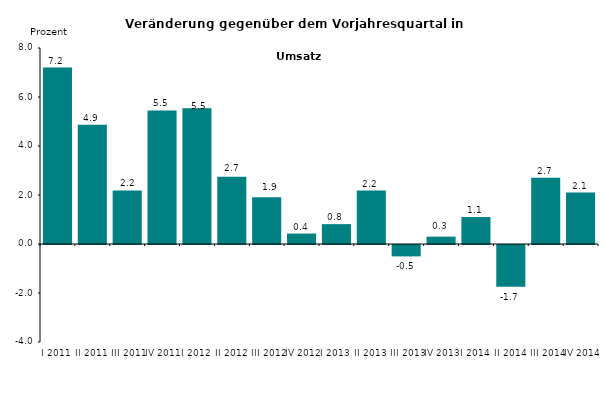
| Category | Series 0 |
|---|---|
| I 2011 | 7.201 |
| II 2011 | 4.867 |
| III 2011 | 2.186 |
| IV 2011 | 5.454 |
| I 2012 | 5.54 |
| II 2012 | 2.745 |
| III 2012 | 1.908 |
| IV 2012 | 0.427 |
| I 2013 | 0.81 |
| II 2013 | 2.181 |
| III 2013 | -0.465 |
| IV 2013 | 0.3 |
| I 2014 | 1.1 |
| II 2014 | -1.7 |
| III 2014 | 2.7 |
| IV 2014 | 2.1 |